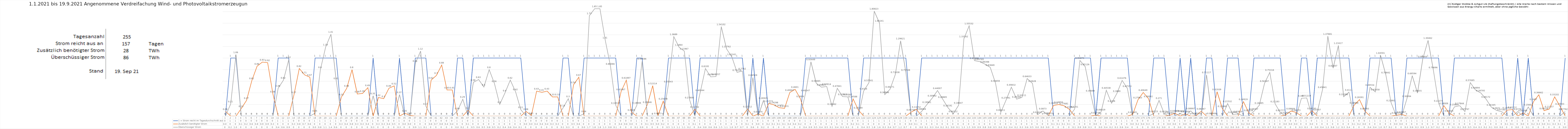
| Category | 1 = Strom reicht im Tagesdurchschnitt aus | Zusätzlich benötigter Strom | Überschüssiger Strom |
|---|---|---|---|
| 0 | 0 | 0.08 | 0 |
| 1 | 1 | 0 | 0.21 |
| 2 | 1 | 0 | 1.06 |
| 3 | 0 | 0.13 | 0 |
| 4 | 0 | 0.27 | 0 |
| 5 | 0 | 0.61 | 0 |
| 6 | 0 | 0.86 | 0 |
| 7 | 0 | 0.93 | 0 |
| 8 | 0 | 0.92 | 0 |
| 9 | 0 | 0.38 | 0 |
| 10 | 1 | 0 | 0.48 |
| 11 | 1 | 0 | 0.62 |
| 12 | 1 | 0 | 0.97 |
| 13 | 0 | 0.37 | 0 |
| 14 | 0 | 0.82 | 0 |
| 15 | 0 | 0.71 | 0 |
| 16 | 0 | 0.67 | 0 |
| 17 | 1 | 0 | 0.05 |
| 18 | 1 | 0 | 0.8 |
| 19 | 1 | 0 | 1.19 |
| 20 | 1 | 0 | 1.41 |
| 21 | 1 | 0 | 0.61 |
| 22 | 0 | 0.33 | 0 |
| 23 | 0 | 0.48 | 0 |
| 24 | 0 | 0.8 | 0 |
| 25 | 0 | 0.38 | 0 |
| 26 | 0 | 0.39 | 0 |
| 27 | 0 | 0.49 | 0 |
| 28 | 1 | 0 | 0.35 |
| 29 | 0 | 0.32 | 0 |
| 30 | 0 | 0.3 | 0 |
| 31 | 0 | 0.48 | 0 |
| 32 | 0 | 0.52 | 0 |
| 33 | 1 | 0 | 0.37 |
| 34 | 0 | 0.05 | 0 |
| 35 | 0 | 0.01 | 0 |
| 36 | 1 | 0 | 0.91 |
| 37 | 1 | 0 | 1.12 |
| 38 | 1 | 0 | 0.17 |
| 39 | 0 | 0.62 | 0 |
| 40 | 0 | 0.7 | 0 |
| 41 | 0 | 0.88 | 0 |
| 42 | 0 | 0.45 | 0 |
| 43 | 0 | 0.45 | 0 |
| 44 | 1 | 0 | 0.09 |
| 45 | 1 | 0 | 0.29 |
| 46 | 0 | 0.1 | 0 |
| 47 | 1 | 0 | 0.58 |
| 48 | 1 | 0 | 0.63 |
| 49 | 1 | 0 | 0.5 |
| 50 | 1 | 0 | 0.8 |
| 51 | 1 | 0 | 0.56 |
| 52 | 1 | 0 | 0.2 |
| 53 | 1 | 0 | 0.4 |
| 54 | 1 | 0 | 0.62 |
| 55 | 1 | 0 | 0.42 |
| 56 | 1 | 0 | 0.11 |
| 57 | 0 | 0.08 | 0 |
| 58 | 0 | 0.01 | 0 |
| 59 | 0 | 0.43 | 0 |
| 60 | 0 | 0.41 | 0 |
| 61 | 0 | 0.43 | 0 |
| 62 | 0 | 0.33 | 0 |
| 63 | 0 | 0.33 | 0 |
| 64 | 1 | 0 | 0.14 |
| 65 | 1 | 0 | 0.3 |
| 66 | 0 | 0.54 | 0 |
| 67 | 0 | 0.67 | 0 |
| 68 | 1 | 0 | 0.04 |
| 69 | 1 | 0 | 1.73 |
| 70 | 1 | 0 | 1.85 |
| 71 | 1 | 0 | 1.85 |
| 72 | 1 | 0 | 1.31 |
| 73 | 1 | 0 | 0.861 |
| 74 | 1 | 0 | 0.185 |
| 75 | 0 | 0.42 | 0 |
| 76 | 0 | 0.619 | 0 |
| 77 | 0 | 0.064 | 0 |
| 78 | 1 | 0 | 0.187 |
| 79 | 1 | 0 | 0.946 |
| 80 | 0 | 0.198 | 0 |
| 81 | 0 | 0.523 | 0 |
| 82 | 0 | 0.007 | 0 |
| 83 | 0 | 0.257 | 0 |
| 84 | 1 | 0 | 0.555 |
| 85 | 1 | 0 | 1.369 |
| 86 | 1 | 0 | 1.186 |
| 87 | 1 | 0 | 1.12 |
| 88 | 1 | 0 | 0.278 |
| 89 | 0 | 0.117 | 0 |
| 90 | 1 | 0 | 0.403 |
| 91 | 1 | 0 | 0.819 |
| 92 | 1 | 0 | 0.676 |
| 93 | 1 | 0 | 0.681 |
| 94 | 1 | 0 | 1.541 |
| 95 | 1 | 0 | 1.158 |
| 96 | 1 | 0 | 1.022 |
| 97 | 1 | 0 | 0.752 |
| 98 | 1 | 0 | 0.776 |
| 99 | 0 | 0.123 | 0 |
| 100 | 1 | 0 | 0.665 |
| 101 | 0 | 0.034 | 0 |
| 102 | 1 | 0 | 0.269 |
| 103 | 0 | 0.218 | 0 |
| 104 | 0 | 0.193 | 0 |
| 105 | 0 | 0.144 | 0 |
| 106 | 0 | 0.133 | 0 |
| 107 | 0 | 0.407 | 0 |
| 108 | 0 | 0.46 | 0 |
| 109 | 0 | 0.3 | 0 |
| 110 | 1 | 0 | 0.402 |
| 111 | 1 | 0 | 0.934 |
| 112 | 1 | 0 | 0.567 |
| 113 | 1 | 0 | 0.498 |
| 114 | 1 | 0 | 0.509 |
| 115 | 1 | 0 | 0.167 |
| 116 | 1 | 0 | 0.478 |
| 117 | 1 | 0 | 0.336 |
| 118 | 1 | 0 | 0.331 |
| 119 | 0 | 0.296 | 0 |
| 120 | 0 | 0.103 | 0 |
| 121 | 1 | 0 | 0.432 |
| 122 | 1 | 0 | 0.575 |
| 123 | 1 | 0 | 1.808 |
| 124 | 1 | 0 | 1.602 |
| 125 | 1 | 0 | 0.369 |
| 126 | 1 | 0 | 0.463 |
| 127 | 1 | 0 | 0.716 |
| 128 | 1 | 0 | 1.296 |
| 129 | 1 | 0 | 0.755 |
| 130 | 0 | 0.067 | 0 |
| 131 | 0 | 0.117 | 0 |
| 132 | 1 | 0 | 0.081 |
| 133 | 1 | 0 | 0.2 |
| 134 | 1 | 0 | 0.31 |
| 135 | 1 | 0 | 0.44 |
| 136 | 1 | 0 | 0.289 |
| 137 | 1 | 0 | 0.142 |
| 138 | 1 | 0 | 0.041 |
| 139 | 1 | 0 | 0.186 |
| 140 | 1 | 0 | 1.332 |
| 141 | 1 | 0 | 1.555 |
| 142 | 1 | 0 | 0.955 |
| 143 | 1 | 0 | 0.938 |
| 144 | 1 | 0 | 0.894 |
| 145 | 1 | 0 | 0.838 |
| 146 | 1 | 0 | 0.567 |
| 147 | 1 | 0 | 0.064 |
| 148 | 1 | 0 | 0.276 |
| 149 | 1 | 0 | 0.498 |
| 150 | 1 | 0 | 0.292 |
| 151 | 1 | 0 | 0.321 |
| 152 | 1 | 0 | 0.646 |
| 153 | 1 | 0 | 0.563 |
| 154 | 1 | 0 | 0.026 |
| 155 | 1 | 0 | 0.087 |
| 156 | 1 | 0 | 0.009 |
| 157 | 0 | 0.184 | 0 |
| 158 | 0 | 0.199 | 0 |
| 159 | 0 | 0.177 | 0 |
| 160 | 0 | 0.116 | 0 |
| 161 | 1 | 0 | 0.12 |
| 162 | 1 | 0 | 0.959 |
| 163 | 1 | 0 | 0.851 |
| 164 | 1 | 0 | 0.397 |
| 165 | 0 | 0.017 | 0 |
| 166 | 1 | 0 | 0.069 |
| 167 | 1 | 0 | 0.445 |
| 168 | 1 | 0 | 0.221 |
| 169 | 1 | 0 | 0.389 |
| 170 | 1 | 0 | 0.615 |
| 171 | 1 | 0 | 0.476 |
| 172 | 0 | 0.027 | 0 |
| 173 | 0 | 0.28 | 0 |
| 174 | 0 | 0.406 | 0 |
| 175 | 0 | 0.3 | 0 |
| 176 | 1 | 0 | 0.042 |
| 177 | 1 | 0 | 0.271 |
| 178 | 1 | 0 | 0.038 |
| 179 | 0 | 0.014 | 0 |
| 180 | 0 | 0.049 | 0 |
| 181 | 1 | 0 | 0.046 |
| 182 | 0 | 0.038 | 0 |
| 183 | 1 | 0 | 0.09 |
| 184 | 0 | 0.005 | 0 |
| 185 | 0 | 0.084 | 0 |
| 186 | 1 | 0 | 0.711 |
| 187 | 1 | 0 | 0.006 |
| 188 | 0 | 0.419 | 0 |
| 189 | 0 | 0.129 | 0 |
| 190 | 1 | 0 | 0.215 |
| 191 | 1 | 0 | 0.026 |
| 192 | 1 | 0 | 0.038 |
| 193 | 0 | 0.249 | 0 |
| 194 | 0 | 0.057 | 0 |
| 195 | 1 | 0 | 0.084 |
| 196 | 1 | 0 | 0.185 |
| 197 | 1 | 0 | 0.563 |
| 198 | 1 | 0 | 0.753 |
| 199 | 1 | 0 | 0.212 |
| 200 | 1 | 0 | 0.058 |
| 201 | 0 | 0.018 | 0 |
| 202 | 0 | 0.087 | 0 |
| 203 | 0 | 0.063 | 0 |
| 204 | 1 | 0 | 0.307 |
| 205 | 1 | 0 | 0.312 |
| 206 | 0 | 0.092 | 0 |
| 207 | 1 | 0 | 0.071 |
| 208 | 1 | 0 | 0.458 |
| 209 | 1 | 0 | 1.377 |
| 210 | 1 | 0 | 0.826 |
| 211 | 1 | 0 | 1.216 |
| 212 | 1 | 0 | 0.333 |
| 213 | 1 | 0 | 0.411 |
| 214 | 0 | 0.189 | 0 |
| 215 | 0 | 0.284 | 0 |
| 216 | 0 | 0.088 | 0 |
| 217 | 1 | 0 | 0.496 |
| 218 | 1 | 0 | 0.417 |
| 219 | 1 | 0 | 1.046 |
| 220 | 1 | 0 | 0.708 |
| 221 | 1 | 0 | 0.229 |
| 222 | 0 | 0.015 | 0 |
| 223 | 0 | 0.029 | 0 |
| 224 | 1 | 0 | 0.301 |
| 225 | 1 | 0 | 0.696 |
| 226 | 1 | 0 | 0.397 |
| 227 | 1 | 0 | 0.987 |
| 228 | 1 | 0 | 1.305 |
| 229 | 1 | 0 | 0.797 |
| 230 | 1 | 0 | 0.223 |
| 231 | 0 | 0.18 | 0 |
| 232 | 0 | 0.049 | 0 |
| 233 | 1 | 0 | 0.158 |
| 234 | 1 | 0 | 0.178 |
| 235 | 1 | 0 | 0.078 |
| 236 | 1 | 0 | 0.577 |
| 237 | 1 | 0 | 0.449 |
| 238 | 1 | 0 | 0.398 |
| 239 | 1 | 0 | 0.292 |
| 240 | 1 | 0 | 0.153 |
| 241 | 1 | 0 | 0.097 |
| 242 | 1 | 0 | 0.074 |
| 243 | 0 | 0.103 | 0 |
| 244 | 0 | 0.112 | 0 |
| 245 | 1 | 0 | 0.078 |
| 246 | 0 | 0.056 | 0 |
| 247 | 1 | 0 | 0.156 |
| 248 | 0 | 0.249 | 0 |
| 249 | 0 | 0.367 | 0 |
| 250 | 0 | 0.092 | 0 |
| 251 | 0 | 0.123 | 0 |
| 252 | 0 | 0.331 | 0 |
| 253 | 0 | 0.17 | 0 |
| 254 | 1 | 0 | 0.078 |